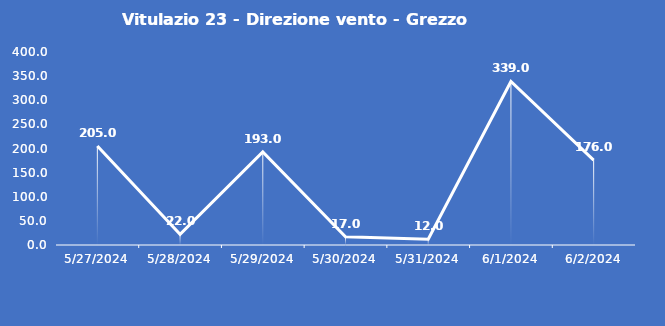
| Category | Vitulazio 23 - Direzione vento - Grezzo (°N) |
|---|---|
| 5/27/24 | 205 |
| 5/28/24 | 22 |
| 5/29/24 | 193 |
| 5/30/24 | 17 |
| 5/31/24 | 12 |
| 6/1/24 | 339 |
| 6/2/24 | 176 |